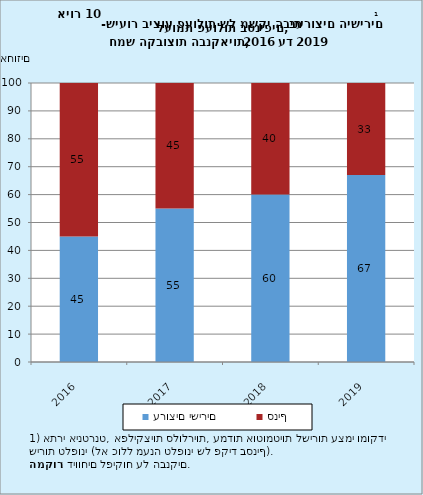
| Category | ערוצים ישירים | סניף |
|---|---|---|
| 2016.0 | 45 | 55 |
| 2017.0 | 55 | 45 |
| 2018.0 | 60 | 40 |
| 2019.0 | 67 | 33 |